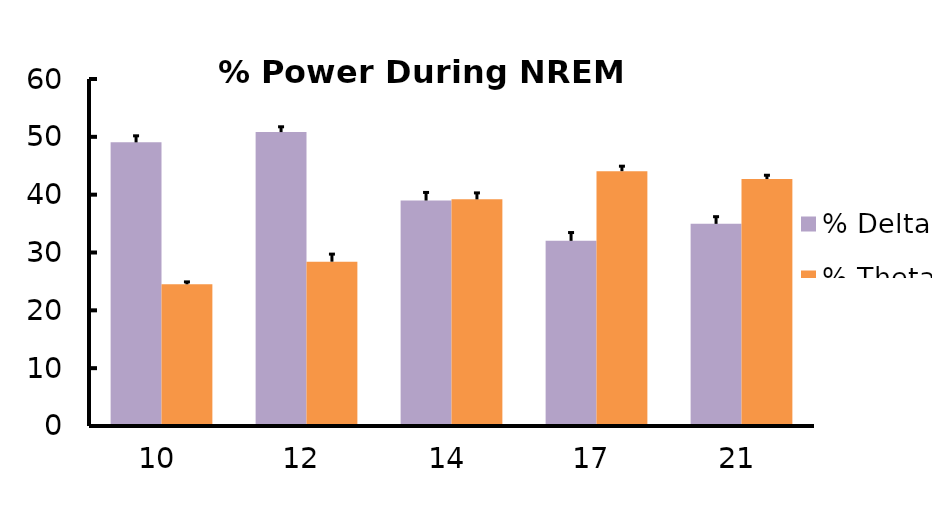
| Category | % Delta | % Theta |
|---|---|---|
| 10 | 49.045 | 24.505 |
| 12 | 50.82 | 28.415 |
| 14 | 38.986 | 39.192 |
| 17 | 32.014 | 44.065 |
| 21 | 34.951 | 42.702 |